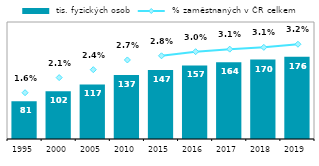
| Category |  tis. fyzických osob |
|---|---|
| 1995 | 80.805 |
| 2000 | 102.004 |
| 2005 | 116.67 |
| 2010 | 136.668 |
| 2015 | 147.389 |
| 2016 | 157.142 |
| 2017 | 164.209 |
| 2018 | 169.722 |
| 2019 | 175.919 |